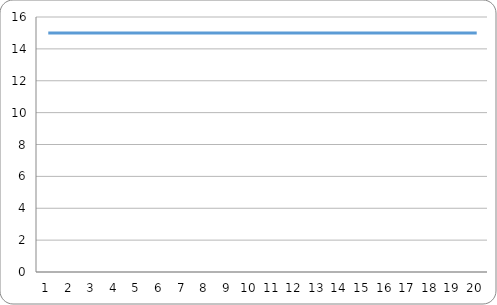
| Category | poor |
|---|---|
| 0 | 15 |
| 1 | 15 |
| 2 | 15 |
| 3 | 15 |
| 4 | 15 |
| 5 | 15 |
| 6 | 15 |
| 7 | 15 |
| 8 | 15 |
| 9 | 15 |
| 10 | 15 |
| 11 | 15 |
| 12 | 15 |
| 13 | 15 |
| 14 | 15 |
| 15 | 15 |
| 16 | 15 |
| 17 | 15 |
| 18 | 15 |
| 19 | 15 |